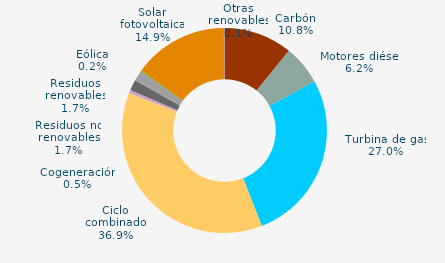
| Category | Series 0 |
|---|---|
| Carbón | 10.807 |
| Motores diésel | 6.246 |
| Turbina de gas | 27.021 |
| Ciclo combinado | 36.869 |
| Generación auxiliar | 0 |
| Cogeneración | 0.516 |
| Residuos no renovables | 1.676 |
| Residuos renovables | 1.676 |
| Eólica | 0.16 |
| Solar fotovoltaica | 14.934 |
| Otras renovables | 0.095 |